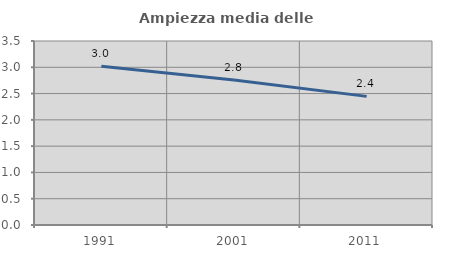
| Category | Ampiezza media delle famiglie |
|---|---|
| 1991.0 | 3.019 |
| 2001.0 | 2.758 |
| 2011.0 | 2.447 |